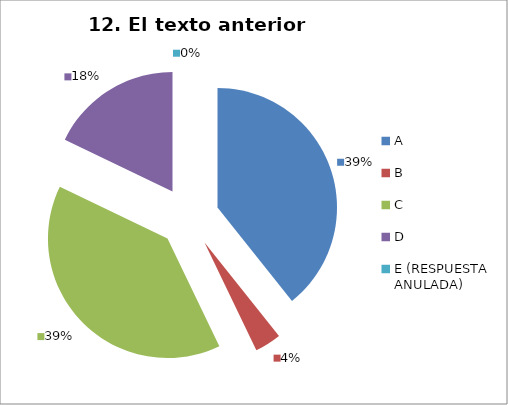
| Category | CANTIDAD DE RESPUESTAS PREGUNTA (12) | PORCENTAJE |
|---|---|---|
| A | 11 | 0.393 |
| B | 1 | 0.036 |
| C | 11 | 0.393 |
| D | 5 | 0.179 |
| E (RESPUESTA ANULADA) | 0 | 0 |